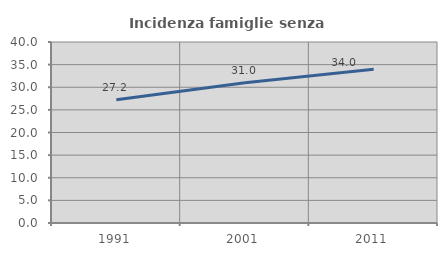
| Category | Incidenza famiglie senza nuclei |
|---|---|
| 1991.0 | 27.213 |
| 2001.0 | 30.999 |
| 2011.0 | 33.987 |